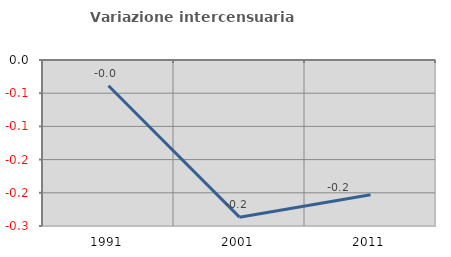
| Category | Variazione intercensuaria annua |
|---|---|
| 1991.0 | -0.039 |
| 2001.0 | -0.237 |
| 2011.0 | -0.203 |